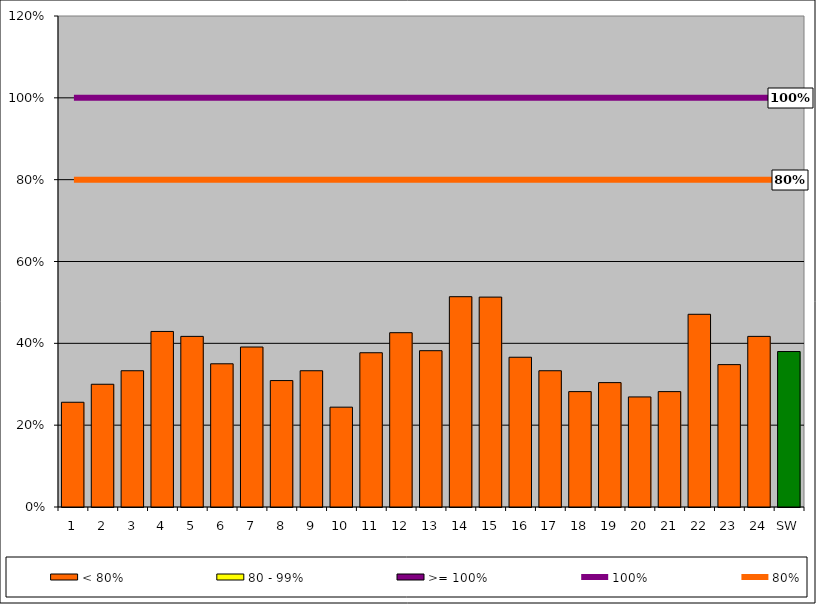
| Category | < 80% | 80 - 99% | >= 100% |
|---|---|---|---|
| 1 | 0.256 | 0 | 0 |
| 2 | 0.3 | 0 | 0 |
| 3 | 0.333 | 0 | 0 |
| 4 | 0.429 | 0 | 0 |
| 5 | 0.417 | 0 | 0 |
| 6 | 0.35 | 0 | 0 |
| 7 | 0.391 | 0 | 0 |
| 8 | 0.309 | 0 | 0 |
| 9 | 0.333 | 0 | 0 |
| 10 | 0.244 | 0 | 0 |
| 11 | 0.377 | 0 | 0 |
| 12 | 0.426 | 0 | 0 |
| 13 | 0.382 | 0 | 0 |
| 14 | 0.514 | 0 | 0 |
| 15 | 0.513 | 0 | 0 |
| 16 | 0.366 | 0 | 0 |
| 17 | 0.333 | 0 | 0 |
| 18 | 0.282 | 0 | 0 |
| 19 | 0.304 | 0 | 0 |
| 20 | 0.269 | 0 | 0 |
| 21 | 0.282 | 0 | 0 |
| 22 | 0.471 | 0 | 0 |
| 23 | 0.348 | 0 | 0 |
| 24 | 0.417 | 0 | 0 |
| SW | 0.38 | 0 | 0 |